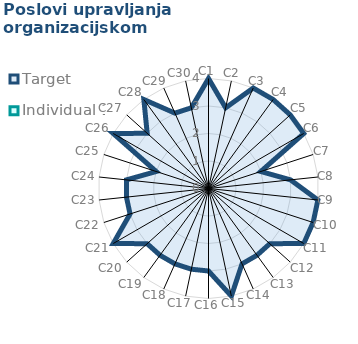
| Category | Target | Individual 1 |
|---|---|---|
| C1 | 4 | 0 |
| C2 | 3 | 0 |
| C3 | 4 | 0 |
| C4 | 4 | 0 |
| C5 | 4 | 0 |
| C6 | 4 | 0 |
| C7 | 2 | 0 |
| C8 | 3 | 0 |
| C9 | 4 | 0 |
| C10 | 4 | 0 |
| C11 | 4 | 0 |
| C12 | 3 | 0 |
| C13 | 3 | 0 |
| C14 | 3 | 0 |
| C15 | 4 | 0 |
| C16 | 3 | 0 |
| C17 | 3 | 0 |
| C18 | 3 | 0 |
| C19 | 3 | 0 |
| C20 | 3 | 0 |
| C21 | 4 | 0 |
| C22 | 3 | 0 |
| C23 | 3 | 0 |
| C24 | 3 | 0 |
| C25 | 2 | 0 |
| C26 | 4 | 0 |
| C27 | 3 | 0 |
| C28 | 4 | 0 |
| C29 | 3 | 0 |
| C30 | 3 | 0 |